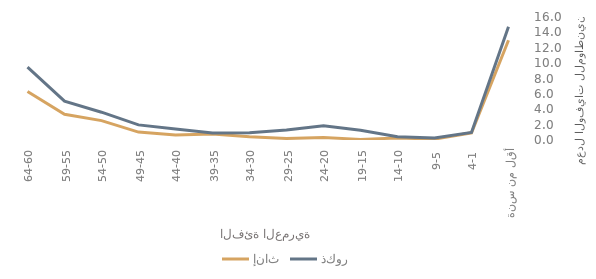
| Category | إناث | ذكور |
|---|---|---|
| أقل من سنة | 12.976 | 14.746 |
| 4-1 | 0.936 | 0.988 |
| 9-5 | 0.116 | 0.272 |
| 14-10 | 0.266 | 0.428 |
| 19-15 | 0.076 | 1.274 |
| 24-20 | 0.335 | 1.847 |
| 29-25 | 0.205 | 1.3 |
| 34-30 | 0.437 | 0.957 |
| 39-35 | 0.778 | 0.91 |
| 44-40 | 0.661 | 1.416 |
| 49-45 | 1.026 | 1.966 |
| 54-50 | 2.52 | 3.617 |
| 59-55 | 3.354 | 5.056 |
| 64-60 | 6.307 | 9.49 |